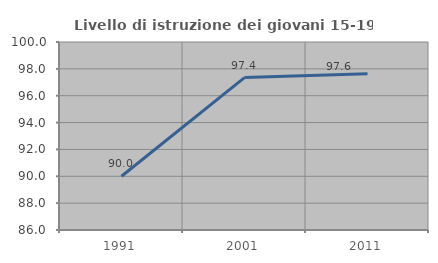
| Category | Livello di istruzione dei giovani 15-19 anni |
|---|---|
| 1991.0 | 90 |
| 2001.0 | 97.351 |
| 2011.0 | 97.633 |